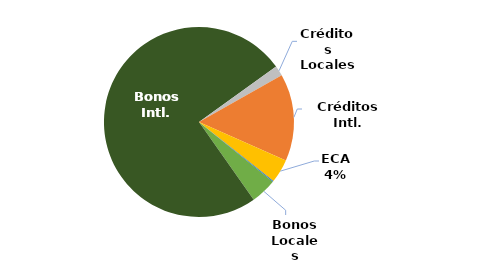
| Category | Series 0 | Series 1 |
|---|---|---|
| Bonos Locales | 0.044 | 0.044 |
| Bonos Intl. | 0.748 | 0.748 |
| Créditos Locales | 0.017 | 0.017 |
| Créditos Intl. | 0.148 | 0.148 |
| ECA | 0.04 | 0.04 |
| Leasing Local | 0.002 | 0.002 |